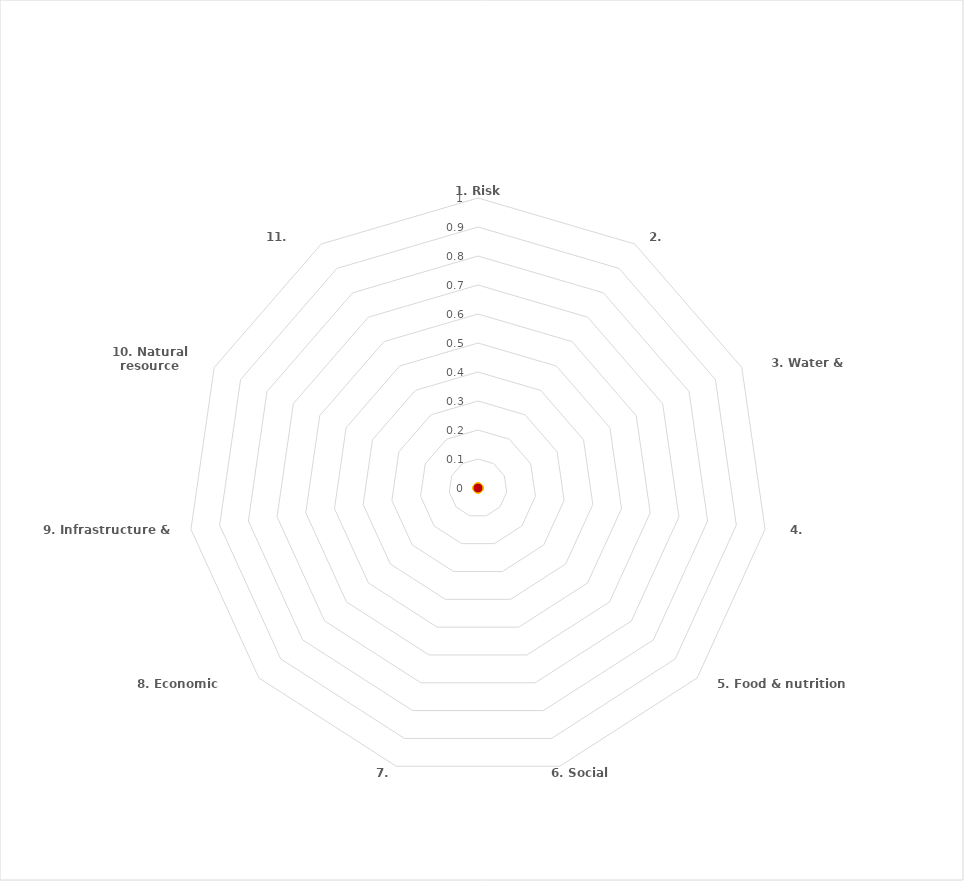
| Category | Series 0 | Series 1 | Series 2 | Series 3 |
|---|---|---|---|---|
| 1. Risk management |  |  |  | 0 |
| 2. Health |  |  |  | 0 |
| 3. Water & sanitation |  |  |  | 0 |
| 4. Shelter |  |  |  | 0 |
| 5. Food & nutrition security |  |  |  | 0 |
| 6. Social cohesion |  |  |  | 0 |
| 7. Inclusion |  |  |  | 0 |
| 8. Economic opportunities |  |  |  | 0 |
| 9. Infrastructure & services |  |  |  | 0 |
| 10. Natural resource management |  |  |  | 0 |
| 11. Connectedness |  |  |  | 0 |